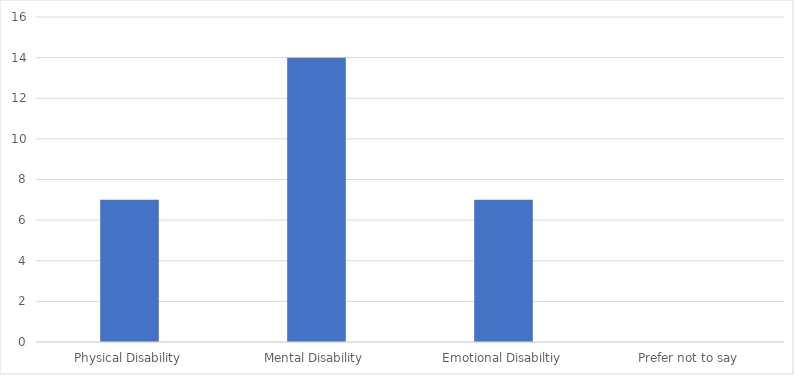
| Category | Number of Responses |
|---|---|
| Physical Disability | 7 |
| Mental Disability | 14 |
| Emotional Disabiltiy | 7 |
| Prefer not to say | 0 |